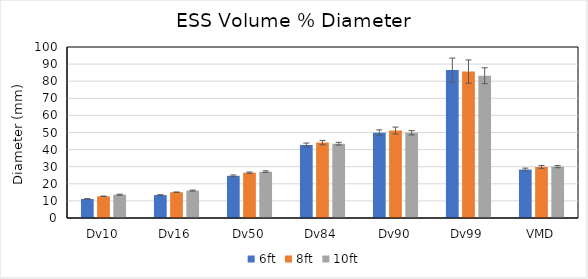
| Category | 6ft | 8ft | 10ft |
|---|---|---|---|
| Dv10 | 11.136 | 12.701 | 13.622 |
| Dv16 | 13.398 | 15.08 | 16.027 |
| Dv50 | 24.675 | 26.514 | 27.103 |
| Dv84 | 42.704 | 44.083 | 43.457 |
| Dv90 | 49.843 | 51.124 | 49.818 |
| Dv99 | 86.507 | 85.619 | 83.184 |
| VMD | 28.345 | 29.846 | 30.06 |